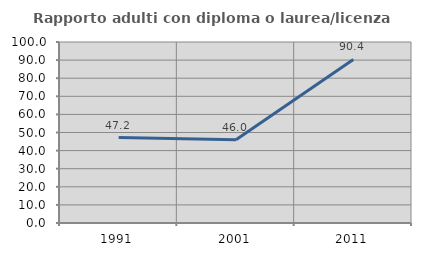
| Category | Rapporto adulti con diploma o laurea/licenza media  |
|---|---|
| 1991.0 | 47.222 |
| 2001.0 | 46 |
| 2011.0 | 90.385 |